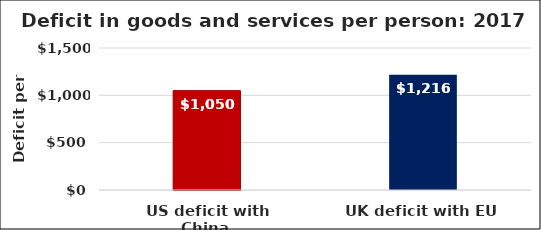
| Category | US$  |
|---|---|
| US deficit with China  | 1049.72 |
| UK deficit with EU | 1216.229 |